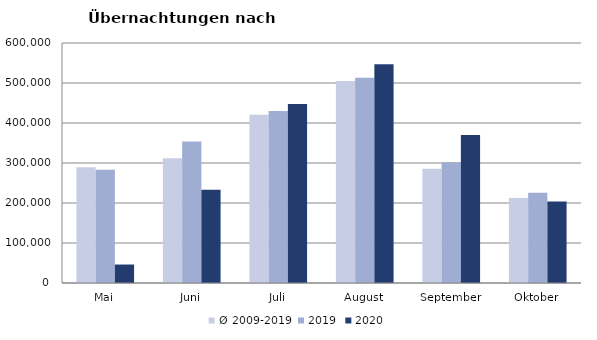
| Category | Ø 2009-2019 | 2019 | 2020 |
|---|---|---|---|
| Mai | 289160.455 | 283418 | 46179 |
| Juni | 311846.455 | 353757 | 233437 |
| Juli | 420827.364 | 430134 | 447640 |
| August | 504983.182 | 513292 | 546671 |
| September | 285692.182 | 301838 | 369853 |
| Oktober | 212345.273 | 225667 | 203478 |